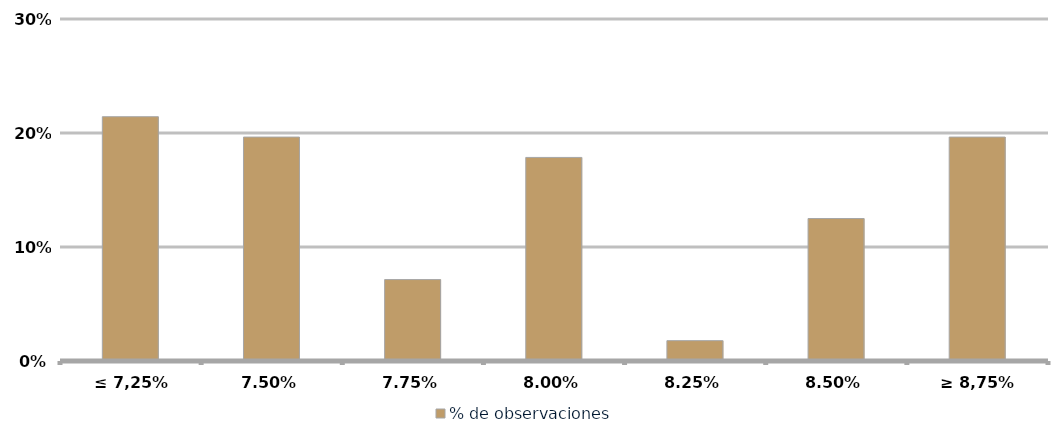
| Category | % de observaciones  |
|---|---|
| ≤ 7,25% | 0.214 |
| 7,50% | 0.196 |
| 7,75% | 0.071 |
| 8,00% | 0.179 |
| 8,25% | 0.018 |
| 8,50% | 0.125 |
| ≥ 8,75% | 0.196 |